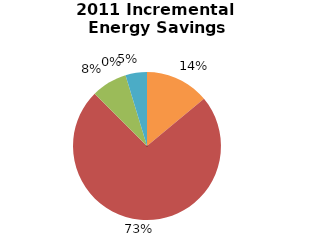
| Category | Incremental Energy Savings (kWh) |
|---|---|
| Consumer Program Total | 137546.554 |
| Business Program Total | 722577.622 |
| Industrial Program Total | 76825.51 |
| Home Assistance Program Total | 0 |
| Pre-2011 Programs completed in 2011 Total | 46058.056 |